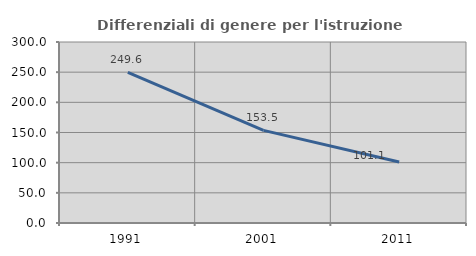
| Category | Differenziali di genere per l'istruzione superiore |
|---|---|
| 1991.0 | 249.6 |
| 2001.0 | 153.507 |
| 2011.0 | 101.053 |